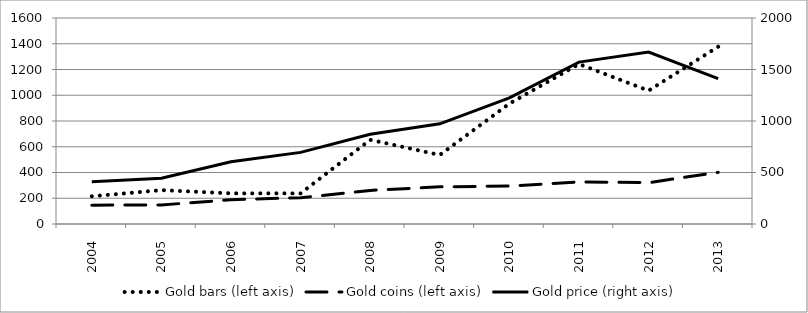
| Category | Gold bars (left axis) | Gold coins (left axis) |
|---|---|---|
| 2004.0 | 215 | 146 |
| 2005.0 | 263 | 148 |
| 2006.0 | 238 | 189 |
| 2007.0 | 238 | 204 |
| 2008.0 | 654 | 261 |
| 2009.0 | 536 | 289 |
| 2010.0 | 935 | 295 |
| 2011.0 | 1242 | 327 |
| 2012.0 | 1036 | 321 |
| 2013.0 | 1377 | 401 |